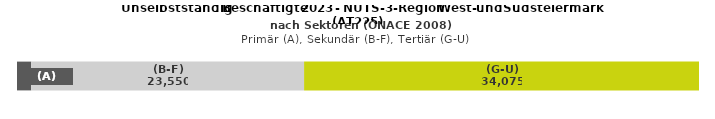
| Category | (A) | (B-F) | (G-U) |
|---|---|---|---|
| 0 | 1223 | 23550 | 34075 |